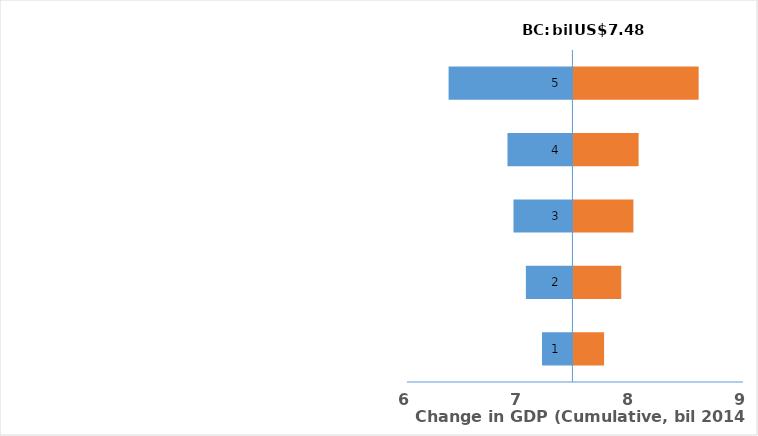
| Category | Series 0 | Series 1 |
|---|---|---|
| 0 | 7.206 | 7.751 |
| 1 | 7.061 | 7.904 |
| 2 | 6.951 | 8.013 |
| 3 | 6.897 | 8.059 |
| 4 | 6.371 | 8.595 |